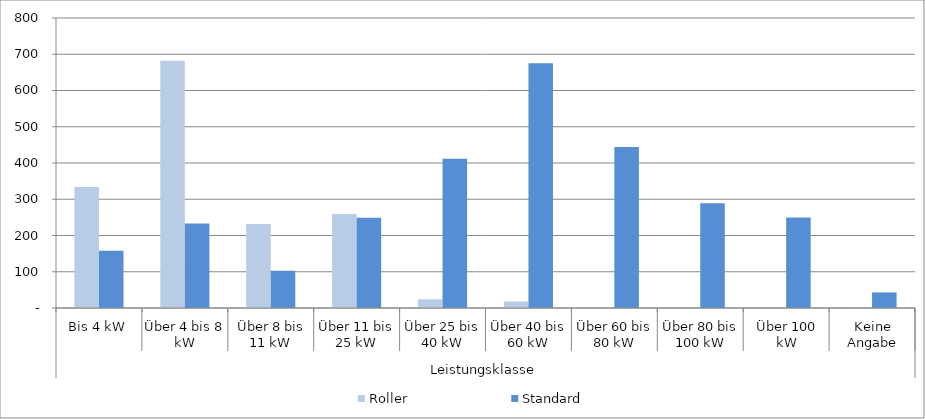
| Category | Roller | Standard |
|---|---|---|
| 0 | 334 | 158 |
| 1 | 682 | 233 |
| 2 | 232 | 103 |
| 3 | 259 | 249 |
| 4 | 24 | 412 |
| 5 | 18 | 675 |
| 6 | 0 | 444 |
| 7 | 0 | 289 |
| 8 | 0 | 250 |
| 9 | 3 | 43 |